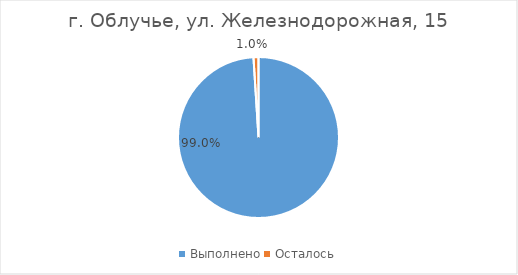
| Category | г. Облучье, ул. Железнодорожная, 15 |
|---|---|
| Выполнено | 0.99 |
| Осталось | 0.01 |